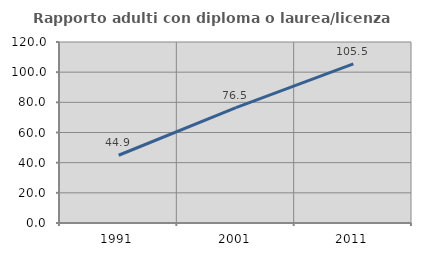
| Category | Rapporto adulti con diploma o laurea/licenza media  |
|---|---|
| 1991.0 | 44.914 |
| 2001.0 | 76.538 |
| 2011.0 | 105.493 |